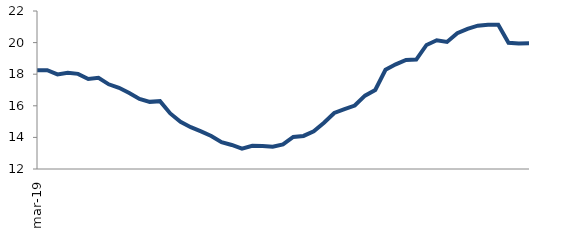
| Category | Series 0 |
|---|---|
| 2019-03-01 | 18.243 |
| 2019-04-01 | 18.254 |
| 2019-05-01 | 17.988 |
| 2019-06-01 | 18.089 |
| 2019-07-01 | 18.02 |
| 2019-08-01 | 17.694 |
| 2019-09-01 | 17.777 |
| 2019-10-01 | 17.36 |
| 2019-11-01 | 17.14 |
| 2019-12-01 | 16.808 |
| 2020-01-01 | 16.434 |
| 2020-02-01 | 16.25 |
| 2020-03-01 | 16.293 |
| 2020-04-01 | 15.517 |
| 2020-05-01 | 14.987 |
| 2020-06-01 | 14.648 |
| 2020-07-01 | 14.379 |
| 2020-08-01 | 14.088 |
| 2020-09-01 | 13.698 |
| 2020-10-01 | 13.522 |
| 2020-11-01 | 13.294 |
| 2020-12-01 | 13.469 |
| 2021-01-01 | 13.453 |
| 2021-02-01 | 13.409 |
| 2021-03-01 | 13.556 |
| 2021-04-01 | 14.027 |
| 2021-05-01 | 14.092 |
| 2021-06-01 | 14.388 |
| 2021-07-01 | 14.927 |
| 2021-08-01 | 15.546 |
| 2021-09-01 | 15.791 |
| 2021-10-01 | 16.017 |
| 2021-11-01 | 16.641 |
| 2021-12-01 | 16.998 |
| 2022-01-01 | 18.278 |
| 2022-02-01 | 18.625 |
| 2022-03-01 | 18.903 |
| 2022-04-01 | 18.924 |
| 2022-05-01 | 19.85 |
| 2022-06-01 | 20.151 |
| 2022-07-01 | 20.044 |
| 2022-08-01 | 20.593 |
| 2022-09-01 | 20.866 |
| 2022-10-01 | 21.074 |
| 2022-11-01 | 21.136 |
| 2022-12-01 | 21.129 |
| 2023-01-01 | 19.993 |
| 2023-02-01 | 19.949 |
| 2023-03-01 | 19.953 |